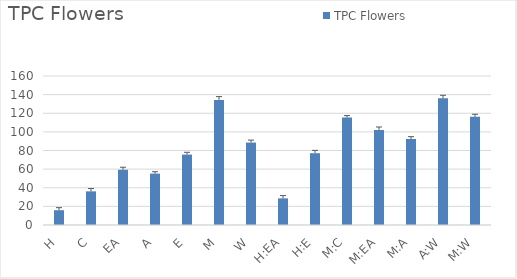
| Category | TPC Flowers |
|---|---|
| H | 15.9 |
| C | 36.137 |
| EA | 59.321 |
| A | 55.182 |
| E | 75.616 |
| M | 134.352 |
| W | 88.498 |
| H:EA | 28.593 |
| H:E | 77.092 |
| M:C | 115.427 |
| M:EA | 102.116 |
| M:A | 92.315 |
| A:W | 136.123 |
| M:W | 116.129 |